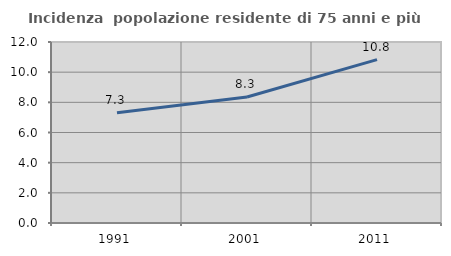
| Category | Incidenza  popolazione residente di 75 anni e più |
|---|---|
| 1991.0 | 7.316 |
| 2001.0 | 8.35 |
| 2011.0 | 10.832 |